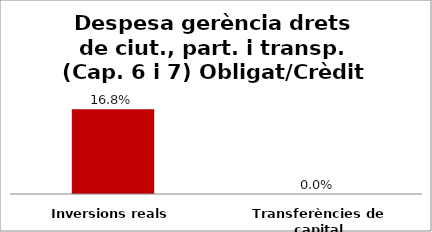
| Category | Series 0 |
|---|---|
| Inversions reals | 0.168 |
| Transferències de capital | 0 |